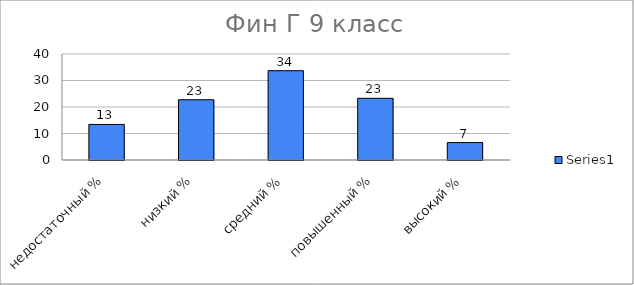
| Category | Series 0 |
|---|---|
| недостаточный % | 13.425 |
| низкий % | 22.74 |
| средний % | 33.699 |
| повышенный % | 23.288 |
| высокий % | 6.575 |